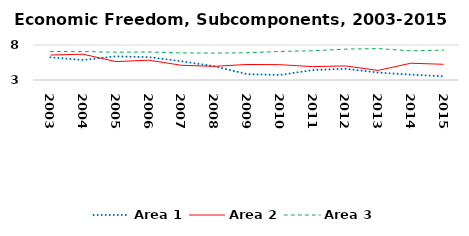
| Category | Area 1 | Area 2 | Area 3 |
|---|---|---|---|
| 2003.0 | 6.239 | 6.571 | 7.058 |
| 2004.0 | 5.861 | 6.687 | 7.06 |
| 2005.0 | 6.379 | 5.626 | 6.969 |
| 2006.0 | 6.265 | 5.834 | 6.998 |
| 2007.0 | 5.679 | 5.102 | 6.872 |
| 2008.0 | 4.966 | 4.95 | 6.843 |
| 2009.0 | 3.838 | 5.221 | 6.885 |
| 2010.0 | 3.714 | 5.191 | 7.082 |
| 2011.0 | 4.416 | 4.911 | 7.174 |
| 2012.0 | 4.609 | 5.012 | 7.407 |
| 2013.0 | 4.061 | 4.369 | 7.49 |
| 2014.0 | 3.767 | 5.397 | 7.169 |
| 2015.0 | 3.525 | 5.245 | 7.26 |